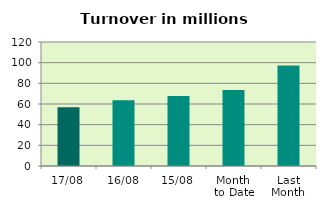
| Category | Series 0 |
|---|---|
| 17/08 | 56.747 |
| 16/08 | 63.613 |
| 15/08 | 67.71 |
| Month 
to Date | 73.441 |
| Last
Month | 97.283 |